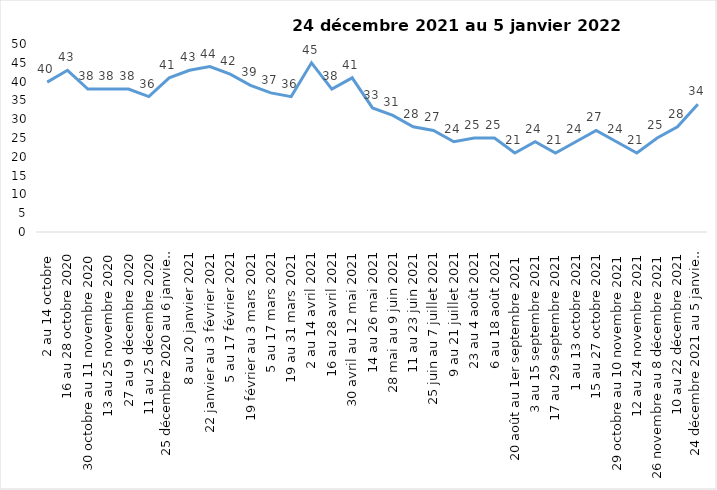
| Category | Toujours aux trois mesures |
|---|---|
| 2 au 14 octobre  | 39.85 |
| 16 au 28 octobre 2020 | 43 |
| 30 octobre au 11 novembre 2020 | 38 |
| 13 au 25 novembre 2020 | 38 |
| 27 au 9 décembre 2020 | 38 |
| 11 au 25 décembre 2020 | 36 |
| 25 décembre 2020 au 6 janvier 2021 | 41 |
| 8 au 20 janvier 2021 | 43 |
| 22 janvier au 3 février 2021 | 44 |
| 5 au 17 février 2021 | 42 |
| 19 février au 3 mars 2021 | 39 |
| 5 au 17 mars 2021 | 37 |
| 19 au 31 mars 2021 | 36 |
| 2 au 14 avril 2021 | 45 |
| 16 au 28 avril 2021 | 38 |
| 30 avril au 12 mai 2021 | 41 |
| 14 au 26 mai 2021 | 33 |
| 28 mai au 9 juin 2021 | 31 |
| 11 au 23 juin 2021 | 28 |
| 25 juin au 7 juillet 2021 | 27 |
| 9 au 21 juillet 2021 | 24 |
| 23 au 4 août 2021 | 25 |
| 6 au 18 août 2021 | 25 |
| 20 août au 1er septembre 2021 | 21 |
| 3 au 15 septembre 2021 | 24 |
| 17 au 29 septembre 2021 | 21 |
| 1 au 13 octobre 2021 | 24 |
| 15 au 27 octobre 2021 | 27 |
| 29 octobre au 10 novembre 2021 | 24 |
| 12 au 24 novembre 2021 | 21 |
| 26 novembre au 8 décembre 2021 | 25 |
| 10 au 22 décembre 2021 | 28 |
| 24 décembre 2021 au 5 janvier 2022 2022 | 34 |